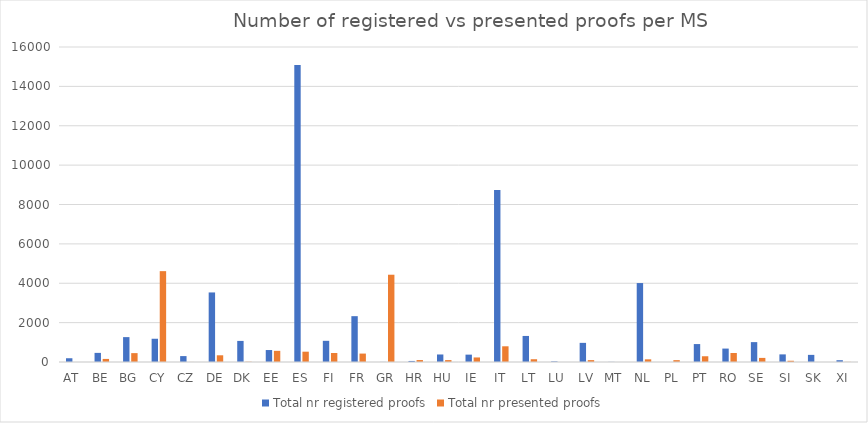
| Category | Total nr registered proofs | Total nr presented proofs |
|---|---|---|
| AT | 191 | 0 |
| BE | 463 | 156 |
| BG | 1264 | 451 |
| CY | 1181 | 4615 |
| CZ | 300 | 2 |
| DE | 3533 | 341 |
| DK | 1071 | 13 |
| EE | 608 | 567 |
| ES | 15091 | 524 |
| FI | 1076 | 457 |
| FR | 2328 | 428 |
| GR | 4 | 4433 |
| HR | 53 | 99 |
| HU | 382 | 97 |
| IE | 374 | 231 |
| IT | 8733 | 798 |
| LT | 1323 | 141 |
| LU | 30 | 0 |
| LV | 972 | 96 |
| MT | 6 | 0 |
| NL | 4010 | 136 |
| PL | 1 | 94 |
| PT | 911 | 292 |
| RO | 682 | 458 |
| SE | 1010 | 208 |
| SI | 387 | 63 |
| SK | 362 | 0 |
| XI | 91 | 6 |